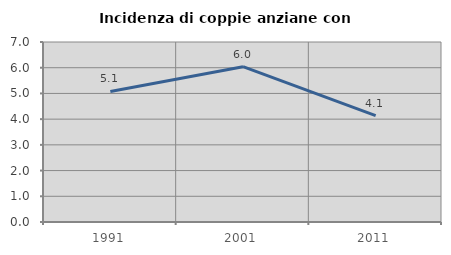
| Category | Incidenza di coppie anziane con figli |
|---|---|
| 1991.0 | 5.078 |
| 2001.0 | 6.04 |
| 2011.0 | 4.14 |